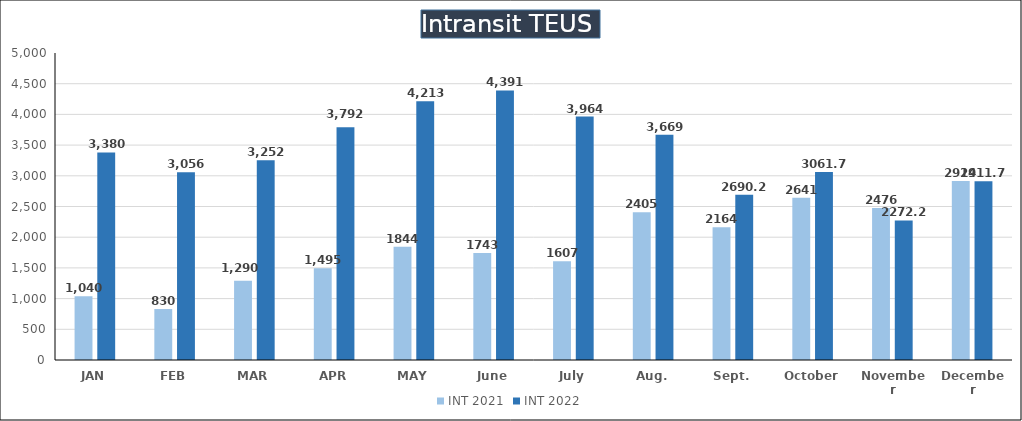
| Category | INT 2021 | INT 2022 |
|---|---|---|
| JAN | 1040 | 3380.25 |
| FEB | 830 | 3056.25 |
| MAR | 1290 | 3252 |
| APR | 1495 | 3792.25 |
| MAY | 1844 | 4213 |
| June | 1743 | 4390.75 |
| July | 1607 | 3964 |
| Aug. | 2405 | 3668.75 |
| Sept. | 2164 | 2690.25 |
| October | 2641 | 3061.75 |
| November | 2476 | 2272.25 |
| December | 2914 | 2911.75 |